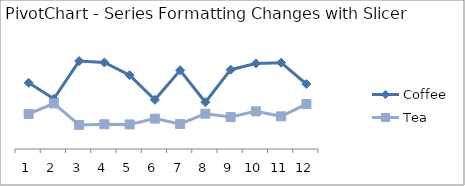
| Category | 2012 - Coffee | 2012 - Tea |
|---|---|---|
| 1 | 1439 | 761 |
| 2 | 1091 | 992 |
| 3 | 1912 | 523 |
| 4 | 1881 | 538 |
| 5 | 1605 | 534 |
| 6 | 1069 | 660 |
| 7 | 1712 | 544 |
| 8 | 1016 | 768 |
| 9 | 1724 | 695 |
| 10 | 1859 | 818 |
| 11 | 1877 | 710 |
| 12 | 1413 | 977 |